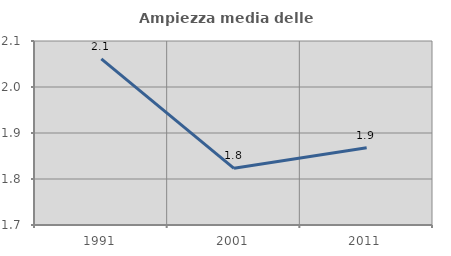
| Category | Ampiezza media delle famiglie |
|---|---|
| 1991.0 | 2.061 |
| 2001.0 | 1.823 |
| 2011.0 | 1.868 |